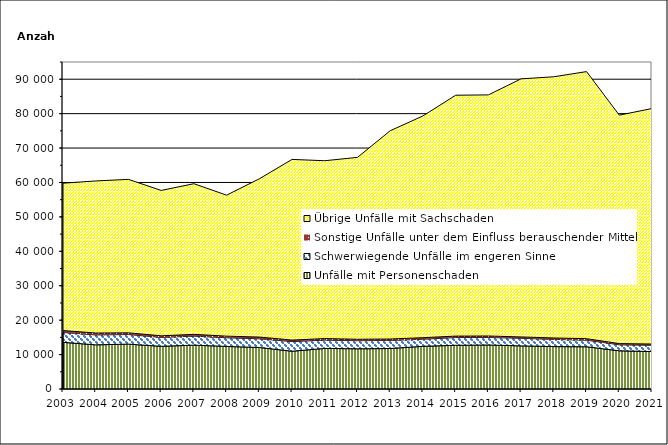
| Category | Unfälle mit Personenschaden | Schwerwiegende Unfälle im engeren Sinne | Sonstige Unfälle unter dem Einfluss berauschender Mittel 1) | Übrige Unfälle mit Sachschaden |
|---|---|---|---|---|
| 2003.0 | 13561 | 2866 | 559 | 42806 |
| 2004.0 | 12827 | 2877 | 564 | 44173 |
| 2005.0 | 13033 | 2795 | 499 | 44581 |
| 2006.0 | 12400 | 2588 | 466 | 42228 |
| 2007.0 | 12740 | 2628 | 507 | 43770 |
| 2008.0 | 12369 | 2510 | 481 | 40954 |
| 2009.0 | 12061 | 2528 | 502 | 45976 |
| 2010.0 | 10974 | 2803 | 441 | 52481 |
| 2011.0 | 11793 | 2419 | 443 | 51662 |
| 2012.0 | 11682 | 2353 | 422 | 52839 |
| 2013.0 | 11757 | 2357 | 414 | 60506 |
| 2014.0 | 12404 | 2056 | 448 | 64425 |
| 2015.0 | 12695 | 2249 | 427 | 69975 |
| 2016.0 | 12783 | 2187 | 433 | 70040 |
| 2017.0 | 12528 | 2214 | 385 | 74978 |
| 2018.0 | 12324 | 2084 | 421 | 75878 |
| 2019.0 | 12271 | 1914 | 438 | 77586 |
| 2020.0 | 11099 | 1748 | 347 | 66372 |
| 2021.0 | 10882 | 1827 | 359 | 68407 |